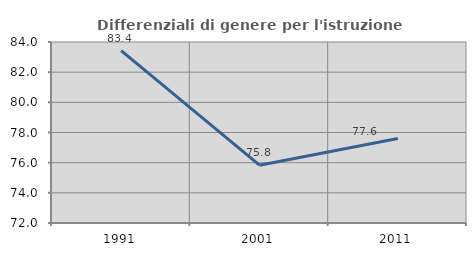
| Category | Differenziali di genere per l'istruzione superiore |
|---|---|
| 1991.0 | 83.422 |
| 2001.0 | 75.833 |
| 2011.0 | 77.602 |